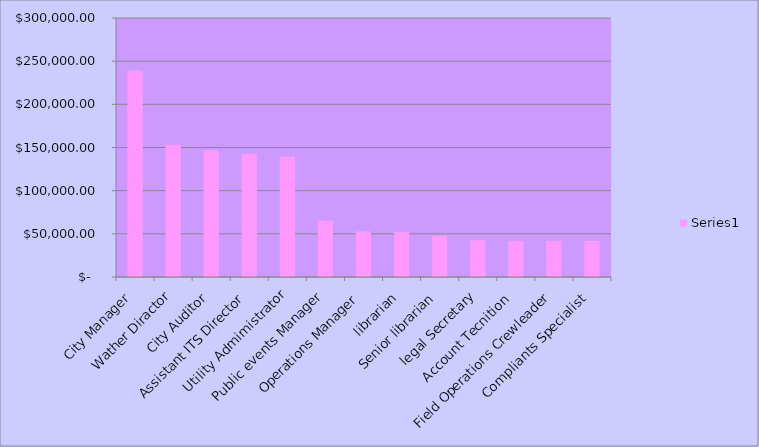
| Category | Series 0 |
|---|---|
| City Manager | 239057.725 |
| Wather Diractor | 153240.88 |
| City Auditor | 146695.64 |
| Assistant ITS Director | 142877.595 |
| Utility Admimistrator | 139190.37 |
| Public events Manager | 65418.44 |
| Operations Manager | 52862.885 |
| librarian | 52241.28 |
| Senior librarian | 47947.64 |
| legal Secretary | 42505.95 |
| Account Tecnition | 41901.6 |
| Field Operations Crewleader | 41879.76 |
| Compliants Specialist | 41771.6 |